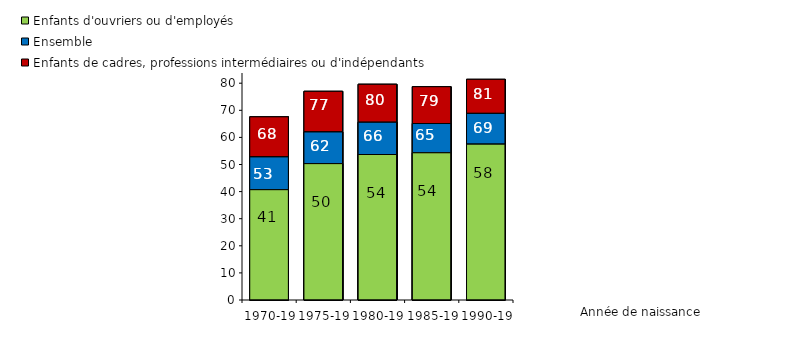
| Category | Enfants d'ouvriers ou d'employés | Ensemble | Enfants de cadres, professions intermédiaires ou d'indépendants |
|---|---|---|---|
| 1970-1974 | 40.7 | 52.8 | 67.6 |
| 1975-1979 | 50.32 | 62 | 77.01 |
| 1980-1984 | 53.69 | 65.59 | 79.61 |
| 1985-1989 | 54.32 | 65.12 | 78.71 |
| 1990-1994p | 57.51 | 68.86 | 81.43 |